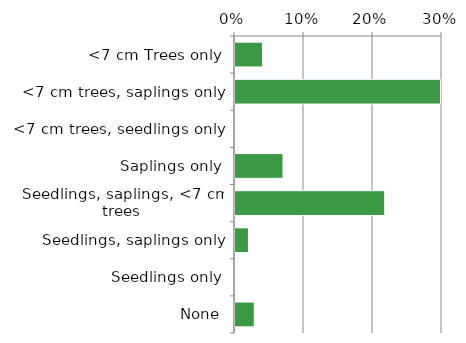
| Category | Native |
|---|---|
| None | 0.029 |
| Seedlings only | 0 |
| Seedlings, saplings only | 0.021 |
| Seedlings, saplings, <7 cm trees | 0.218 |
| Saplings only | 0.071 |
| <7 cm trees, seedlings only | 0 |
| <7 cm trees, saplings only | 0.299 |
| <7 cm Trees only | 0.041 |